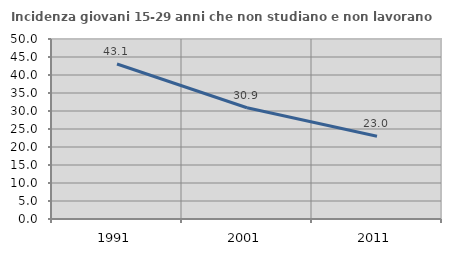
| Category | Incidenza giovani 15-29 anni che non studiano e non lavorano  |
|---|---|
| 1991.0 | 43.059 |
| 2001.0 | 30.914 |
| 2011.0 | 22.973 |